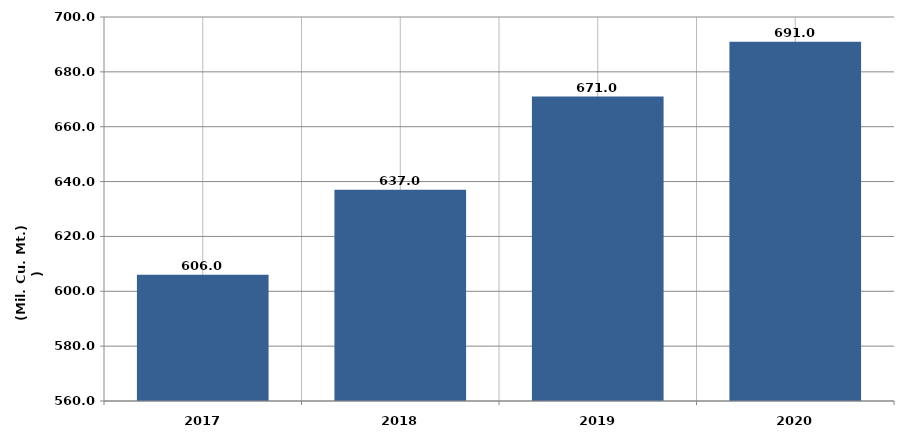
| Category |  انتاج المياه 
( مليون متر مكعب  ) |
|---|---|
| 2017.0 | 606 |
| 2018.0 | 637 |
| 2019.0 | 671 |
| 2020.0 | 691 |